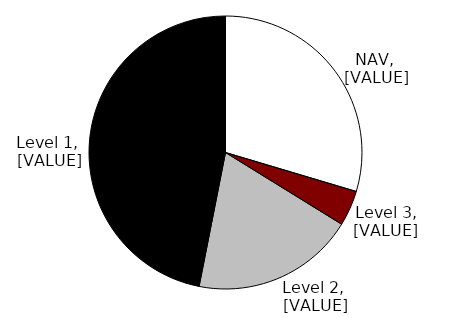
| Category | Share of Assets by Level |
|---|---|
| 0 | 0.296 |
| 1 | 0.042 |
| 2 | 0.193 |
| 3 | 0.469 |